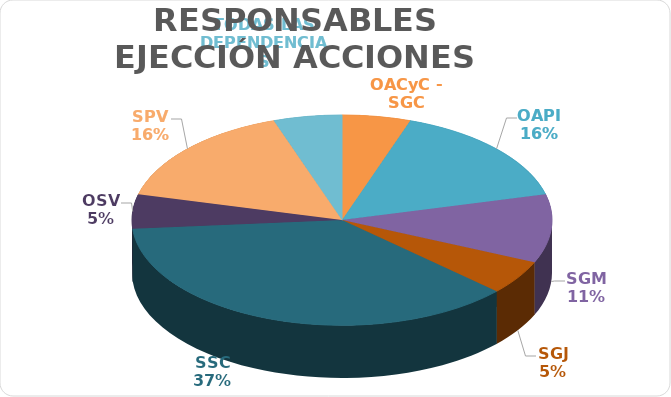
| Category | Series 0 |
|---|---|
| OACyC - SGC | 1 |
| OAPI | 3 |
| SGM | 2 |
| SGJ | 1 |
| SSC | 7 |
| OSV | 1 |
| SPV | 3 |
| TODAS LAS DEPENDENCIAS | 1 |